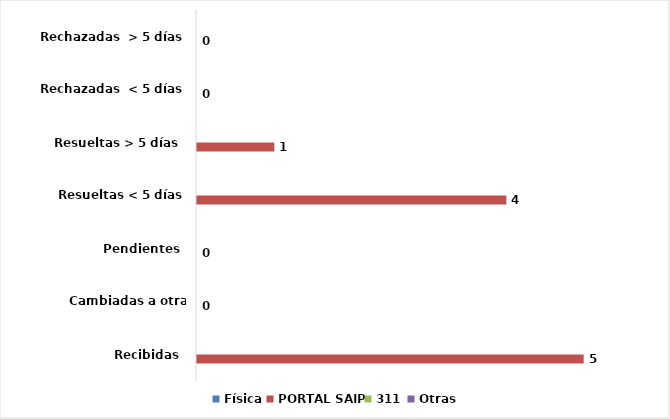
| Category | Física | PORTAL SAIP | 311 | Otras |
|---|---|---|---|---|
| Recibidas  | 0 | 5 | 0 | 0 |
| Cambiadas a otra institución | 0 | 0 | 0 | 0 |
| Pendientes  | 0 | 0 | 0 | 0 |
| Resueltas < 5 días | 0 | 4 | 0 | 0 |
| Resueltas > 5 días  | 0 | 1 | 0 | 0 |
| Rechazadas  < 5 días | 0 | 0 | 0 | 0 |
| Rechazadas  > 5 días | 0 | 0 | 0 | 0 |